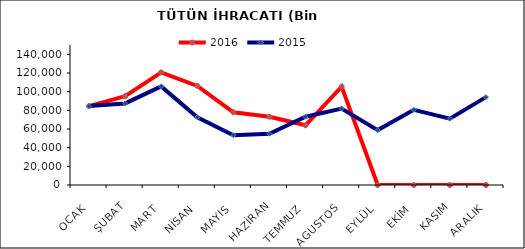
| Category | 2016 | 2015 |
|---|---|---|
| OCAK | 84511.731 | 84587.382 |
| ŞUBAT | 95207.149 | 87419.751 |
| MART | 120666.016 | 105669.318 |
| NİSAN | 106168.637 | 72638.579 |
| MAYIS | 77918.444 | 53359.857 |
| HAZİRAN | 73102.883 | 54936.205 |
| TEMMUZ | 64000.109 | 73120.95 |
| AGUSTOS | 105346.228 | 81940.677 |
| EYLÜL | 0 | 58821.082 |
| EKİM | 0 | 80593.647 |
| KASIM | 0 | 71026.911 |
| ARALIK | 0 | 94139.503 |